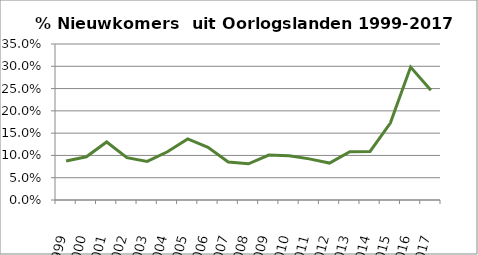
| Category | Series 10 |
|---|---|
| 1999.0 | 0.088 |
| 2000.0 | 0.097 |
| 2001.0 | 0.13 |
| 2002.0 | 0.095 |
| 2003.0 | 0.087 |
| 2004.0 | 0.108 |
| 2005.0 | 0.137 |
| 2006.0 | 0.118 |
| 2007.0 | 0.085 |
| 2008.0 | 0.081 |
| 2009.0 | 0.101 |
| 2010.0 | 0.099 |
| 2011.0 | 0.092 |
| 2012.0 | 0.083 |
| 2013.0 | 0.109 |
| 2014.0 | 0.109 |
| 2015.0 | 0.172 |
| 2016.0 | 0.298 |
| 2017.0 | 0.246 |